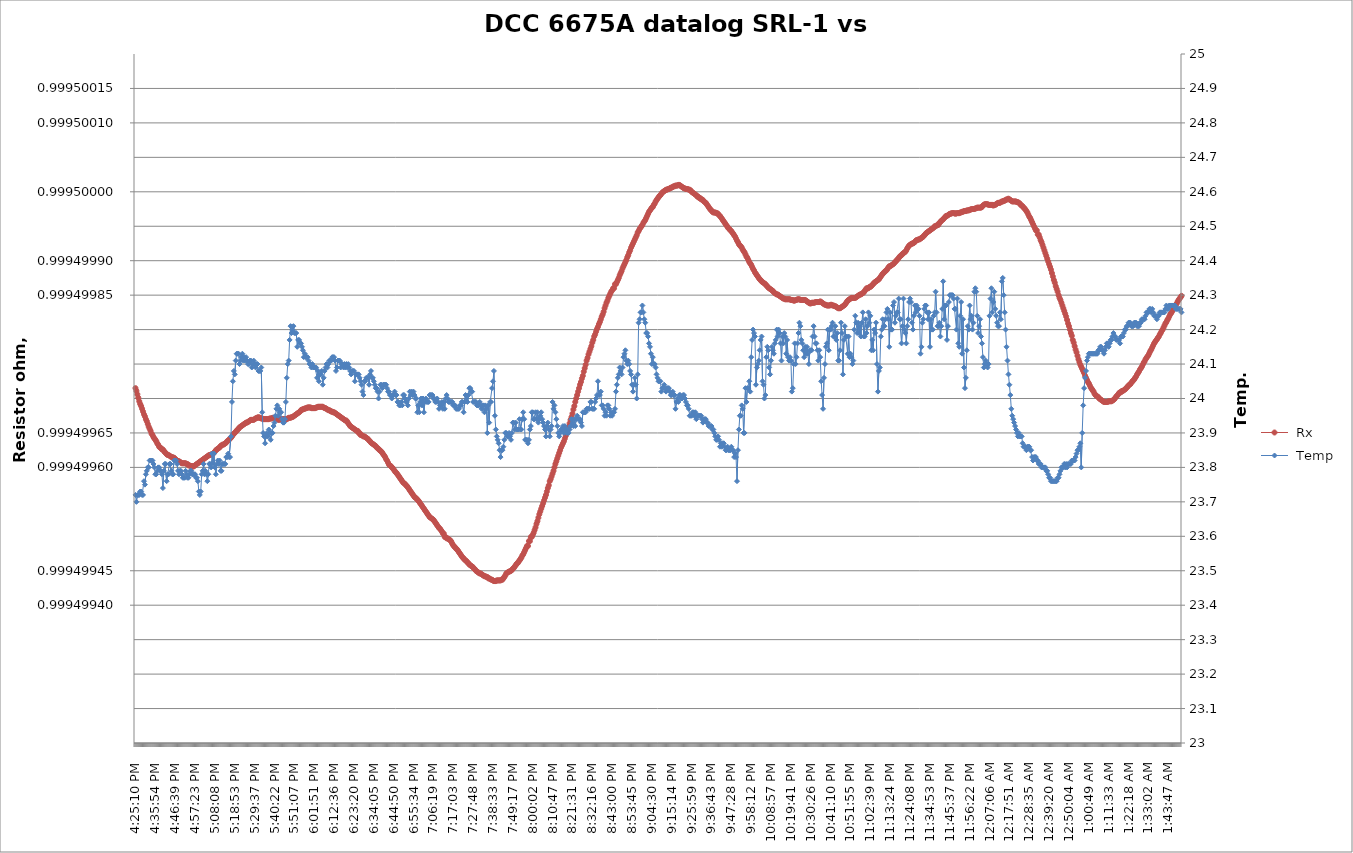
| Category |  Rx |
|---|---|
| 2021-03-13 16:25:10 | 0.999 |
| 2021-03-13 16:25:40 | 0.999 |
| 2021-03-13 16:26:11 | 0.999 |
| 2021-03-13 16:26:42 | 0.999 |
| 2021-03-13 16:27:12 | 0.999 |
| 2021-03-13 16:27:43 | 0.999 |
| 2021-03-13 16:28:14 | 0.999 |
| 2021-03-13 16:28:44 | 0.999 |
| 2021-03-13 16:29:15 | 0.999 |
| 2021-03-13 16:29:46 | 0.999 |
| 2021-03-13 16:30:17 | 0.999 |
| 2021-03-13 16:30:47 | 0.999 |
| 2021-03-13 16:31:18 | 0.999 |
| 2021-03-13 16:31:49 | 0.999 |
| 2021-03-13 16:32:19 | 0.999 |
| 2021-03-13 16:32:50 | 0.999 |
| 2021-03-13 16:33:21 | 0.999 |
| 2021-03-13 16:33:51 | 0.999 |
| 2021-03-13 16:34:22 | 0.999 |
| 2021-03-13 16:34:53 | 0.999 |
| 2021-03-13 16:35:23 | 0.999 |
| 2021-03-13 16:35:54 | 0.999 |
| 2021-03-13 16:36:25 | 0.999 |
| 2021-03-13 16:36:56 | 0.999 |
| 2021-03-13 16:37:26 | 0.999 |
| 2021-03-13 16:37:57 | 0.999 |
| 2021-03-13 16:38:28 | 0.999 |
| 2021-03-13 16:38:58 | 0.999 |
| 2021-03-13 16:39:29 | 0.999 |
| 2021-03-13 16:40:00 | 0.999 |
| 2021-03-13 16:40:30 | 0.999 |
| 2021-03-13 16:41:01 | 0.999 |
| 2021-03-13 16:41:32 | 0.999 |
| 2021-03-13 16:42:03 | 0.999 |
| 2021-03-13 16:42:33 | 0.999 |
| 2021-03-13 16:43:04 | 0.999 |
| 2021-03-13 16:43:35 | 0.999 |
| 2021-03-13 16:44:05 | 0.999 |
| 2021-03-13 16:44:36 | 0.999 |
| 2021-03-13 16:45:07 | 0.999 |
| 2021-03-13 16:45:37 | 0.999 |
| 2021-03-13 16:46:08 | 0.999 |
| 2021-03-13 16:46:39 | 0.999 |
| 2021-03-13 16:47:09 | 0.999 |
| 2021-03-13 16:47:40 | 0.999 |
| 2021-03-13 16:48:11 | 0.999 |
| 2021-03-13 16:48:42 | 0.999 |
| 2021-03-13 16:49:12 | 0.999 |
| 2021-03-13 16:49:43 | 0.999 |
| 2021-03-13 16:50:14 | 0.999 |
| 2021-03-13 16:50:44 | 0.999 |
| 2021-03-13 16:51:15 | 0.999 |
| 2021-03-13 16:51:46 | 0.999 |
| 2021-03-13 16:52:16 | 0.999 |
| 2021-03-13 16:52:47 | 0.999 |
| 2021-03-13 16:53:18 | 0.999 |
| 2021-03-13 16:53:49 | 0.999 |
| 2021-03-13 16:54:19 | 0.999 |
| 2021-03-13 16:54:50 | 0.999 |
| 2021-03-13 16:55:21 | 0.999 |
| 2021-03-13 16:55:51 | 0.999 |
| 2021-03-13 16:56:22 | 0.999 |
| 2021-03-13 16:56:53 | 0.999 |
| 2021-03-13 16:57:23 | 0.999 |
| 2021-03-13 16:57:54 | 0.999 |
| 2021-03-13 16:58:25 | 0.999 |
| 2021-03-13 16:58:56 | 0.999 |
| 2021-03-13 16:59:26 | 0.999 |
| 2021-03-13 16:59:57 | 0.999 |
| 2021-03-13 17:00:28 | 0.999 |
| 2021-03-13 17:00:58 | 0.999 |
| 2021-03-13 17:01:29 | 0.999 |
| 2021-03-13 17:02:00 | 0.999 |
| 2021-03-13 17:02:30 | 0.999 |
| 2021-03-13 17:03:01 | 0.999 |
| 2021-03-13 17:03:32 | 0.999 |
| 2021-03-13 17:04:02 | 0.999 |
| 2021-03-13 17:04:33 | 0.999 |
| 2021-03-13 17:05:04 | 0.999 |
| 2021-03-13 17:05:35 | 0.999 |
| 2021-03-13 17:06:05 | 0.999 |
| 2021-03-13 17:06:36 | 0.999 |
| 2021-03-13 17:07:07 | 0.999 |
| 2021-03-13 17:07:37 | 0.999 |
| 2021-03-13 17:08:08 | 0.999 |
| 2021-03-13 17:08:39 | 0.999 |
| 2021-03-13 17:09:09 | 0.999 |
| 2021-03-13 17:09:40 | 0.999 |
| 2021-03-13 17:10:11 | 0.999 |
| 2021-03-13 17:10:42 | 0.999 |
| 2021-03-13 17:11:12 | 0.999 |
| 2021-03-13 17:11:43 | 0.999 |
| 2021-03-13 17:12:14 | 0.999 |
| 2021-03-13 17:12:44 | 0.999 |
| 2021-03-13 17:13:15 | 0.999 |
| 2021-03-13 17:13:46 | 0.999 |
| 2021-03-13 17:14:16 | 0.999 |
| 2021-03-13 17:14:47 | 0.999 |
| 2021-03-13 17:15:18 | 0.999 |
| 2021-03-13 17:15:48 | 0.999 |
| 2021-03-13 17:16:19 | 0.999 |
| 2021-03-13 17:16:50 | 0.999 |
| 2021-03-13 17:17:21 | 0.999 |
| 2021-03-13 17:17:51 | 0.999 |
| 2021-03-13 17:18:22 | 0.999 |
| 2021-03-13 17:18:53 | 0.999 |
| 2021-03-13 17:19:23 | 0.999 |
| 2021-03-13 17:19:54 | 0.999 |
| 2021-03-13 17:20:25 | 0.999 |
| 2021-03-13 17:20:55 | 0.999 |
| 2021-03-13 17:21:26 | 0.999 |
| 2021-03-13 17:21:57 | 0.999 |
| 2021-03-13 17:22:28 | 0.999 |
| 2021-03-13 17:22:58 | 0.999 |
| 2021-03-13 17:23:29 | 0.999 |
| 2021-03-13 17:24:00 | 0.999 |
| 2021-03-13 17:24:30 | 0.999 |
| 2021-03-13 17:25:01 | 0.999 |
| 2021-03-13 17:25:32 | 0.999 |
| 2021-03-13 17:26:02 | 0.999 |
| 2021-03-13 17:26:33 | 0.999 |
| 2021-03-13 17:27:04 | 0.999 |
| 2021-03-13 17:27:34 | 0.999 |
| 2021-03-13 17:28:05 | 0.999 |
| 2021-03-13 17:28:36 | 0.999 |
| 2021-03-13 17:29:07 | 0.999 |
| 2021-03-13 17:29:37 | 0.999 |
| 2021-03-13 17:30:08 | 0.999 |
| 2021-03-13 17:30:39 | 0.999 |
| 2021-03-13 17:31:09 | 0.999 |
| 2021-03-13 17:31:40 | 0.999 |
| 2021-03-13 17:32:11 | 0.999 |
| 2021-03-13 17:32:41 | 0.999 |
| 2021-03-13 17:33:12 | 0.999 |
| 2021-03-13 17:33:43 | 0.999 |
| 2021-03-13 17:34:14 | 0.999 |
| 2021-03-13 17:34:44 | 0.999 |
| 2021-03-13 17:35:15 | 0.999 |
| 2021-03-13 17:35:46 | 0.999 |
| 2021-03-13 17:36:16 | 0.999 |
| 2021-03-13 17:36:47 | 0.999 |
| 2021-03-13 17:37:18 | 0.999 |
| 2021-03-13 17:37:48 | 0.999 |
| 2021-03-13 17:38:19 | 0.999 |
| 2021-03-13 17:38:50 | 0.999 |
| 2021-03-13 17:39:20 | 0.999 |
| 2021-03-13 17:39:51 | 0.999 |
| 2021-03-13 17:40:22 | 0.999 |
| 2021-03-13 17:40:53 | 0.999 |
| 2021-03-13 17:41:23 | 0.999 |
| 2021-03-13 17:41:54 | 0.999 |
| 2021-03-13 17:42:25 | 0.999 |
| 2021-03-13 17:42:55 | 0.999 |
| 2021-03-13 17:43:26 | 0.999 |
| 2021-03-13 17:43:57 | 0.999 |
| 2021-03-13 17:44:27 | 0.999 |
| 2021-03-13 17:44:58 | 0.999 |
| 2021-03-13 17:45:29 | 0.999 |
| 2021-03-13 17:46:00 | 0.999 |
| 2021-03-13 17:46:30 | 0.999 |
| 2021-03-13 17:47:01 | 0.999 |
| 2021-03-13 17:47:32 | 0.999 |
| 2021-03-13 17:48:02 | 0.999 |
| 2021-03-13 17:48:33 | 0.999 |
| 2021-03-13 17:49:04 | 0.999 |
| 2021-03-13 17:49:34 | 0.999 |
| 2021-03-13 17:50:05 | 0.999 |
| 2021-03-13 17:50:36 | 0.999 |
| 2021-03-13 17:51:07 | 0.999 |
| 2021-03-13 17:51:37 | 0.999 |
| 2021-03-13 17:52:08 | 0.999 |
| 2021-03-13 17:52:39 | 0.999 |
| 2021-03-13 17:53:09 | 0.999 |
| 2021-03-13 17:53:40 | 0.999 |
| 2021-03-13 17:54:11 | 0.999 |
| 2021-03-13 17:54:41 | 0.999 |
| 2021-03-13 17:55:12 | 0.999 |
| 2021-03-13 17:55:43 | 0.999 |
| 2021-03-13 17:56:14 | 0.999 |
| 2021-03-13 17:56:44 | 0.999 |
| 2021-03-13 17:57:15 | 0.999 |
| 2021-03-13 17:57:46 | 0.999 |
| 2021-03-13 17:58:16 | 0.999 |
| 2021-03-13 17:58:47 | 0.999 |
| 2021-03-13 17:59:18 | 0.999 |
| 2021-03-13 17:59:48 | 0.999 |
| 2021-03-13 18:00:19 | 0.999 |
| 2021-03-13 18:00:50 | 0.999 |
| 2021-03-13 18:01:20 | 0.999 |
| 2021-03-13 18:01:51 | 0.999 |
| 2021-03-13 18:02:22 | 0.999 |
| 2021-03-13 18:02:53 | 0.999 |
| 2021-03-13 18:03:23 | 0.999 |
| 2021-03-13 18:03:54 | 0.999 |
| 2021-03-13 18:04:25 | 0.999 |
| 2021-03-13 18:04:55 | 0.999 |
| 2021-03-13 18:05:26 | 0.999 |
| 2021-03-13 18:05:57 | 0.999 |
| 2021-03-13 18:06:27 | 0.999 |
| 2021-03-13 18:06:58 | 0.999 |
| 2021-03-13 18:07:29 | 0.999 |
| 2021-03-13 18:08:00 | 0.999 |
| 2021-03-13 18:08:30 | 0.999 |
| 2021-03-13 18:09:01 | 0.999 |
| 2021-03-13 18:09:32 | 0.999 |
| 2021-03-13 18:10:02 | 0.999 |
| 2021-03-13 18:10:33 | 0.999 |
| 2021-03-13 18:11:04 | 0.999 |
| 2021-03-13 18:11:34 | 0.999 |
| 2021-03-13 18:12:05 | 0.999 |
| 2021-03-13 18:12:36 | 0.999 |
| 2021-03-13 18:13:07 | 0.999 |
| 2021-03-13 18:13:37 | 0.999 |
| 2021-03-13 18:14:08 | 0.999 |
| 2021-03-13 18:14:39 | 0.999 |
| 2021-03-13 18:15:09 | 0.999 |
| 2021-03-13 18:15:40 | 0.999 |
| 2021-03-13 18:16:11 | 0.999 |
| 2021-03-13 18:16:41 | 0.999 |
| 2021-03-13 18:17:12 | 0.999 |
| 2021-03-13 18:17:43 | 0.999 |
| 2021-03-13 18:18:13 | 0.999 |
| 2021-03-13 18:18:44 | 0.999 |
| 2021-03-13 18:19:15 | 0.999 |
| 2021-03-13 18:19:46 | 0.999 |
| 2021-03-13 18:20:16 | 0.999 |
| 2021-03-13 18:20:47 | 0.999 |
| 2021-03-13 18:21:18 | 0.999 |
| 2021-03-13 18:21:48 | 0.999 |
| 2021-03-13 18:22:19 | 0.999 |
| 2021-03-13 18:22:50 | 0.999 |
| 2021-03-13 18:23:20 | 0.999 |
| 2021-03-13 18:23:51 | 0.999 |
| 2021-03-13 18:24:22 | 0.999 |
| 2021-03-13 18:24:53 | 0.999 |
| 2021-03-13 18:25:23 | 0.999 |
| 2021-03-13 18:25:54 | 0.999 |
| 2021-03-13 18:26:25 | 0.999 |
| 2021-03-13 18:26:55 | 0.999 |
| 2021-03-13 18:27:26 | 0.999 |
| 2021-03-13 18:27:57 | 0.999 |
| 2021-03-13 18:28:27 | 0.999 |
| 2021-03-13 18:28:58 | 0.999 |
| 2021-03-13 18:29:29 | 0.999 |
| 2021-03-13 18:29:59 | 0.999 |
| 2021-03-13 18:30:30 | 0.999 |
| 2021-03-13 18:31:01 | 0.999 |
| 2021-03-13 18:31:32 | 0.999 |
| 2021-03-13 18:32:02 | 0.999 |
| 2021-03-13 18:32:33 | 0.999 |
| 2021-03-13 18:33:04 | 0.999 |
| 2021-03-13 18:33:34 | 0.999 |
| 2021-03-13 18:34:05 | 0.999 |
| 2021-03-13 18:34:36 | 0.999 |
| 2021-03-13 18:35:06 | 0.999 |
| 2021-03-13 18:35:37 | 0.999 |
| 2021-03-13 18:36:08 | 0.999 |
| 2021-03-13 18:36:39 | 0.999 |
| 2021-03-13 18:37:09 | 0.999 |
| 2021-03-13 18:37:40 | 0.999 |
| 2021-03-13 18:38:11 | 0.999 |
| 2021-03-13 18:38:41 | 0.999 |
| 2021-03-13 18:39:12 | 0.999 |
| 2021-03-13 18:39:43 | 0.999 |
| 2021-03-13 18:40:13 | 0.999 |
| 2021-03-13 18:40:44 | 0.999 |
| 2021-03-13 18:41:15 | 0.999 |
| 2021-03-13 18:41:46 | 0.999 |
| 2021-03-13 18:42:16 | 0.999 |
| 2021-03-13 18:42:47 | 0.999 |
| 2021-03-13 18:43:18 | 0.999 |
| 2021-03-13 18:43:48 | 0.999 |
| 2021-03-13 18:44:19 | 0.999 |
| 2021-03-13 18:44:50 | 0.999 |
| 2021-03-13 18:45:20 | 0.999 |
| 2021-03-13 18:45:51 | 0.999 |
| 2021-03-13 18:46:22 | 0.999 |
| 2021-03-13 18:46:52 | 0.999 |
| 2021-03-13 18:47:23 | 0.999 |
| 2021-03-13 18:47:54 | 0.999 |
| 2021-03-13 18:48:25 | 0.999 |
| 2021-03-13 18:48:55 | 0.999 |
| 2021-03-13 18:49:26 | 0.999 |
| 2021-03-13 18:49:57 | 0.999 |
| 2021-03-13 18:50:27 | 0.999 |
| 2021-03-13 18:50:58 | 0.999 |
| 2021-03-13 18:51:29 | 0.999 |
| 2021-03-13 18:51:59 | 0.999 |
| 2021-03-13 18:52:30 | 0.999 |
| 2021-03-13 18:53:01 | 0.999 |
| 2021-03-13 18:53:31 | 0.999 |
| 2021-03-13 18:54:02 | 0.999 |
| 2021-03-13 18:54:33 | 0.999 |
| 2021-03-13 18:55:04 | 0.999 |
| 2021-03-13 18:55:34 | 0.999 |
| 2021-03-13 18:56:05 | 0.999 |
| 2021-03-13 18:56:36 | 0.999 |
| 2021-03-13 18:57:06 | 0.999 |
| 2021-03-13 18:57:37 | 0.999 |
| 2021-03-13 18:58:08 | 0.999 |
| 2021-03-13 18:58:38 | 0.999 |
| 2021-03-13 18:59:09 | 0.999 |
| 2021-03-13 18:59:40 | 0.999 |
| 2021-03-13 19:00:11 | 0.999 |
| 2021-03-13 19:00:41 | 0.999 |
| 2021-03-13 19:01:12 | 0.999 |
| 2021-03-13 19:01:43 | 0.999 |
| 2021-03-13 19:02:13 | 0.999 |
| 2021-03-13 19:02:44 | 0.999 |
| 2021-03-13 19:03:15 | 0.999 |
| 2021-03-13 19:03:45 | 0.999 |
| 2021-03-13 19:04:16 | 0.999 |
| 2021-03-13 19:04:47 | 0.999 |
| 2021-03-13 19:05:17 | 0.999 |
| 2021-03-13 19:05:48 | 0.999 |
| 2021-03-13 19:06:19 | 0.999 |
| 2021-03-13 19:06:50 | 0.999 |
| 2021-03-13 19:07:20 | 0.999 |
| 2021-03-13 19:07:51 | 0.999 |
| 2021-03-13 19:08:22 | 0.999 |
| 2021-03-13 19:08:52 | 0.999 |
| 2021-03-13 19:09:23 | 0.999 |
| 2021-03-13 19:09:54 | 0.999 |
| 2021-03-13 19:10:24 | 0.999 |
| 2021-03-13 19:10:55 | 0.999 |
| 2021-03-13 19:11:26 | 0.999 |
| 2021-03-13 19:11:56 | 0.999 |
| 2021-03-13 19:12:27 | 0.999 |
| 2021-03-13 19:12:58 | 0.999 |
| 2021-03-13 19:13:29 | 0.999 |
| 2021-03-13 19:13:59 | 0.999 |
| 2021-03-13 19:14:30 | 0.999 |
| 2021-03-13 19:15:01 | 0.999 |
| 2021-03-13 19:15:31 | 0.999 |
| 2021-03-13 19:16:02 | 0.999 |
| 2021-03-13 19:16:33 | 0.999 |
| 2021-03-13 19:17:03 | 0.999 |
| 2021-03-13 19:17:34 | 0.999 |
| 2021-03-13 19:18:05 | 0.999 |
| 2021-03-13 19:18:36 | 0.999 |
| 2021-03-13 19:19:06 | 0.999 |
| 2021-03-13 19:19:37 | 0.999 |
| 2021-03-13 19:20:08 | 0.999 |
| 2021-03-13 19:20:38 | 0.999 |
| 2021-03-13 19:21:09 | 0.999 |
| 2021-03-13 19:21:40 | 0.999 |
| 2021-03-13 19:22:10 | 0.999 |
| 2021-03-13 19:22:41 | 0.999 |
| 2021-03-13 19:23:12 | 0.999 |
| 2021-03-13 19:23:42 | 0.999 |
| 2021-03-13 19:24:13 | 0.999 |
| 2021-03-13 19:24:44 | 0.999 |
| 2021-03-13 19:25:15 | 0.999 |
| 2021-03-13 19:25:45 | 0.999 |
| 2021-03-13 19:26:16 | 0.999 |
| 2021-03-13 19:26:47 | 0.999 |
| 2021-03-13 19:27:17 | 0.999 |
| 2021-03-13 19:27:48 | 0.999 |
| 2021-03-13 19:28:19 | 0.999 |
| 2021-03-13 19:28:49 | 0.999 |
| 2021-03-13 19:29:20 | 0.999 |
| 2021-03-13 19:29:51 | 0.999 |
| 2021-03-13 19:30:21 | 0.999 |
| 2021-03-13 19:30:52 | 0.999 |
| 2021-03-13 19:31:23 | 0.999 |
| 2021-03-13 19:31:54 | 0.999 |
| 2021-03-13 19:32:24 | 0.999 |
| 2021-03-13 19:32:55 | 0.999 |
| 2021-03-13 19:33:26 | 0.999 |
| 2021-03-13 19:33:56 | 0.999 |
| 2021-03-13 19:34:27 | 0.999 |
| 2021-03-13 19:34:58 | 0.999 |
| 2021-03-13 19:35:28 | 0.999 |
| 2021-03-13 19:35:59 | 0.999 |
| 2021-03-13 19:36:30 | 0.999 |
| 2021-03-13 19:37:01 | 0.999 |
| 2021-03-13 19:37:31 | 0.999 |
| 2021-03-13 19:38:02 | 0.999 |
| 2021-03-13 19:38:33 | 0.999 |
| 2021-03-13 19:39:03 | 0.999 |
| 2021-03-13 19:39:34 | 0.999 |
| 2021-03-13 19:40:05 | 0.999 |
| 2021-03-13 19:40:35 | 0.999 |
| 2021-03-13 19:41:06 | 0.999 |
| 2021-03-13 19:41:37 | 0.999 |
| 2021-03-13 19:42:07 | 0.999 |
| 2021-03-13 19:42:38 | 0.999 |
| 2021-03-13 19:43:09 | 0.999 |
| 2021-03-13 19:43:40 | 0.999 |
| 2021-03-13 19:44:10 | 0.999 |
| 2021-03-13 19:44:41 | 0.999 |
| 2021-03-13 19:45:12 | 0.999 |
| 2021-03-13 19:45:42 | 0.999 |
| 2021-03-13 19:46:13 | 0.999 |
| 2021-03-13 19:46:44 | 0.999 |
| 2021-03-13 19:47:14 | 0.999 |
| 2021-03-13 19:47:45 | 0.999 |
| 2021-03-13 19:48:16 | 0.999 |
| 2021-03-13 19:48:47 | 0.999 |
| 2021-03-13 19:49:17 | 0.999 |
| 2021-03-13 19:49:48 | 0.999 |
| 2021-03-13 19:50:19 | 0.999 |
| 2021-03-13 19:50:49 | 0.999 |
| 2021-03-13 19:51:20 | 0.999 |
| 2021-03-13 19:51:51 | 0.999 |
| 2021-03-13 19:52:21 | 0.999 |
| 2021-03-13 19:52:52 | 0.999 |
| 2021-03-13 19:53:23 | 0.999 |
| 2021-03-13 19:53:54 | 0.999 |
| 2021-03-13 19:54:24 | 0.999 |
| 2021-03-13 19:54:55 | 0.999 |
| 2021-03-13 19:55:26 | 0.999 |
| 2021-03-13 19:55:56 | 0.999 |
| 2021-03-13 19:56:27 | 0.999 |
| 2021-03-13 19:56:58 | 0.999 |
| 2021-03-13 19:57:28 | 0.999 |
| 2021-03-13 19:57:59 | 0.999 |
| 2021-03-13 19:58:30 | 0.999 |
| 2021-03-13 19:59:00 | 0.999 |
| 2021-03-13 19:59:31 | 0.999 |
| 2021-03-13 20:00:02 | 0.999 |
| 2021-03-13 20:00:33 | 0.999 |
| 2021-03-13 20:01:03 | 0.999 |
| 2021-03-13 20:01:34 | 0.999 |
| 2021-03-13 20:02:05 | 0.999 |
| 2021-03-13 20:02:35 | 0.999 |
| 2021-03-13 20:03:06 | 0.999 |
| 2021-03-13 20:03:37 | 0.999 |
| 2021-03-13 20:04:07 | 0.999 |
| 2021-03-13 20:04:38 | 0.999 |
| 2021-03-13 20:05:09 | 0.999 |
| 2021-03-13 20:05:40 | 0.999 |
| 2021-03-13 20:06:10 | 0.999 |
| 2021-03-13 20:06:41 | 0.999 |
| 2021-03-13 20:07:12 | 0.999 |
| 2021-03-13 20:07:42 | 0.999 |
| 2021-03-13 20:08:13 | 0.999 |
| 2021-03-13 20:08:44 | 0.999 |
| 2021-03-13 20:09:14 | 0.999 |
| 2021-03-13 20:09:45 | 0.999 |
| 2021-03-13 20:10:16 | 0.999 |
| 2021-03-13 20:10:47 | 0.999 |
| 2021-03-13 20:11:17 | 0.999 |
| 2021-03-13 20:11:48 | 0.999 |
| 2021-03-13 20:12:19 | 0.999 |
| 2021-03-13 20:12:49 | 0.999 |
| 2021-03-13 20:13:20 | 0.999 |
| 2021-03-13 20:13:51 | 0.999 |
| 2021-03-13 20:14:21 | 0.999 |
| 2021-03-13 20:14:52 | 0.999 |
| 2021-03-13 20:15:23 | 0.999 |
| 2021-03-13 20:15:53 | 0.999 |
| 2021-03-13 20:16:24 | 0.999 |
| 2021-03-13 20:16:55 | 0.999 |
| 2021-03-13 20:17:26 | 0.999 |
| 2021-03-13 20:17:56 | 0.999 |
| 2021-03-13 20:18:27 | 0.999 |
| 2021-03-13 20:18:58 | 0.999 |
| 2021-03-13 20:19:28 | 0.999 |
| 2021-03-13 20:19:59 | 0.999 |
| 2021-03-13 20:20:30 | 0.999 |
| 2021-03-13 20:21:00 | 0.999 |
| 2021-03-13 20:21:31 | 0.999 |
| 2021-03-13 20:22:02 | 0.999 |
| 2021-03-13 20:22:32 | 0.999 |
| 2021-03-13 20:23:03 | 0.999 |
| 2021-03-13 20:23:34 | 0.999 |
| 2021-03-13 20:24:05 | 0.999 |
| 2021-03-13 20:24:35 | 0.999 |
| 2021-03-13 20:25:06 | 0.999 |
| 2021-03-13 20:25:37 | 0.999 |
| 2021-03-13 20:26:07 | 0.999 |
| 2021-03-13 20:26:38 | 0.999 |
| 2021-03-13 20:27:09 | 0.999 |
| 2021-03-13 20:27:39 | 0.999 |
| 2021-03-13 20:28:10 | 0.999 |
| 2021-03-13 20:28:41 | 0.999 |
| 2021-03-13 20:29:12 | 0.999 |
| 2021-03-13 20:29:42 | 0.999 |
| 2021-03-13 20:30:13 | 0.999 |
| 2021-03-13 20:30:44 | 0.999 |
| 2021-03-13 20:31:14 | 0.999 |
| 2021-03-13 20:31:45 | 0.999 |
| 2021-03-13 20:32:16 | 0.999 |
| 2021-03-13 20:32:46 | 0.999 |
| 2021-03-13 20:33:17 | 0.999 |
| 2021-03-13 20:33:48 | 0.999 |
| 2021-03-13 20:34:18 | 0.999 |
| 2021-03-13 20:34:49 | 0.999 |
| 2021-03-13 20:35:20 | 0.999 |
| 2021-03-13 20:35:51 | 0.999 |
| 2021-03-13 20:36:21 | 0.999 |
| 2021-03-13 20:36:52 | 0.999 |
| 2021-03-13 20:37:23 | 0.999 |
| 2021-03-13 20:37:53 | 0.999 |
| 2021-03-13 20:38:24 | 0.999 |
| 2021-03-13 20:38:55 | 0.999 |
| 2021-03-13 20:39:25 | 0.999 |
| 2021-03-13 20:39:56 | 0.999 |
| 2021-03-13 20:40:27 | 0.999 |
| 2021-03-13 20:40:58 | 0.999 |
| 2021-03-13 20:41:28 | 0.999 |
| 2021-03-13 20:41:59 | 0.999 |
| 2021-03-13 20:42:30 | 0.999 |
| 2021-03-13 20:43:00 | 0.999 |
| 2021-03-13 20:43:31 | 0.999 |
| 2021-03-13 20:44:02 | 0.999 |
| 2021-03-13 20:44:32 | 0.999 |
| 2021-03-13 20:45:03 | 0.999 |
| 2021-03-13 20:45:34 | 0.999 |
| 2021-03-13 20:46:05 | 0.999 |
| 2021-03-13 20:46:35 | 0.999 |
| 2021-03-13 20:47:06 | 0.999 |
| 2021-03-13 20:47:37 | 0.999 |
| 2021-03-13 20:48:07 | 0.999 |
| 2021-03-13 20:48:38 | 0.999 |
| 2021-03-13 20:49:09 | 0.999 |
| 2021-03-13 20:49:39 | 0.999 |
| 2021-03-13 20:50:10 | 0.999 |
| 2021-03-13 20:50:41 | 0.999 |
| 2021-03-13 20:51:11 | 0.999 |
| 2021-03-13 20:51:42 | 0.999 |
| 2021-03-13 20:52:13 | 0.999 |
| 2021-03-13 20:52:44 | 0.999 |
| 2021-03-13 20:53:14 | 0.999 |
| 2021-03-13 20:53:45 | 0.999 |
| 2021-03-13 20:54:16 | 0.999 |
| 2021-03-13 20:54:46 | 0.999 |
| 2021-03-13 20:55:17 | 0.999 |
| 2021-03-13 20:55:48 | 0.999 |
| 2021-03-13 20:56:18 | 0.999 |
| 2021-03-13 20:56:49 | 0.999 |
| 2021-03-13 20:57:20 | 0.999 |
| 2021-03-13 20:57:51 | 0.999 |
| 2021-03-13 20:58:21 | 0.999 |
| 2021-03-13 20:58:52 | 0.999 |
| 2021-03-13 20:59:23 | 0.999 |
| 2021-03-13 20:59:53 | 0.999 |
| 2021-03-13 21:00:24 | 0.999 |
| 2021-03-13 21:00:55 | 0.999 |
| 2021-03-13 21:01:25 | 0.999 |
| 2021-03-13 21:01:56 | 0.999 |
| 2021-03-13 21:02:27 | 0.999 |
| 2021-03-13 21:02:57 | 0.999 |
| 2021-03-13 21:03:28 | 0.999 |
| 2021-03-13 21:03:59 | 0.999 |
| 2021-03-13 21:04:30 | 0.999 |
| 2021-03-13 21:05:00 | 0.999 |
| 2021-03-13 21:05:31 | 0.999 |
| 2021-03-13 21:06:02 | 0.999 |
| 2021-03-13 21:06:32 | 0.999 |
| 2021-03-13 21:07:03 | 0.999 |
| 2021-03-13 21:07:34 | 0.999 |
| 2021-03-13 21:08:04 | 0.999 |
| 2021-03-13 21:08:35 | 0.999 |
| 2021-03-13 21:09:06 | 0.999 |
| 2021-03-13 21:09:36 | 0.999 |
| 2021-03-13 21:10:07 | 0.999 |
| 2021-03-13 21:10:38 | 1 |
| 2021-03-13 21:11:09 | 1 |
| 2021-03-13 21:11:39 | 1 |
| 2021-03-13 21:12:10 | 1 |
| 2021-03-13 21:12:41 | 1 |
| 2021-03-13 21:13:11 | 1 |
| 2021-03-13 21:13:42 | 1 |
| 2021-03-13 21:14:13 | 1 |
| 2021-03-13 21:14:43 | 1 |
| 2021-03-13 21:15:14 | 1 |
| 2021-03-13 21:15:45 | 1 |
| 2021-03-13 21:16:15 | 1 |
| 2021-03-13 21:16:46 | 1 |
| 2021-03-13 21:17:17 | 1 |
| 2021-03-13 21:17:48 | 1 |
| 2021-03-13 21:18:18 | 1 |
| 2021-03-13 21:18:49 | 1 |
| 2021-03-13 21:19:20 | 1 |
| 2021-03-13 21:19:50 | 1 |
| 2021-03-13 21:20:21 | 1 |
| 2021-03-13 21:20:52 | 1 |
| 2021-03-13 21:21:22 | 1 |
| 2021-03-13 21:21:53 | 1 |
| 2021-03-13 21:22:24 | 1 |
| 2021-03-13 21:22:54 | 1 |
| 2021-03-13 21:23:25 | 1 |
| 2021-03-13 21:23:56 | 1 |
| 2021-03-13 21:24:26 | 1 |
| 2021-03-13 21:24:57 | 1 |
| 2021-03-13 21:25:28 | 1 |
| 2021-03-13 21:25:59 | 1 |
| 2021-03-13 21:26:29 | 0.999 |
| 2021-03-13 21:27:00 | 0.999 |
| 2021-03-13 21:27:31 | 0.999 |
| 2021-03-13 21:28:01 | 0.999 |
| 2021-03-13 21:28:32 | 0.999 |
| 2021-03-13 21:29:03 | 0.999 |
| 2021-03-13 21:29:33 | 0.999 |
| 2021-03-13 21:30:04 | 0.999 |
| 2021-03-13 21:30:35 | 0.999 |
| 2021-03-13 21:31:05 | 0.999 |
| 2021-03-13 21:31:36 | 0.999 |
| 2021-03-13 21:32:07 | 0.999 |
| 2021-03-13 21:32:38 | 0.999 |
| 2021-03-13 21:33:08 | 0.999 |
| 2021-03-13 21:33:39 | 0.999 |
| 2021-03-13 21:34:10 | 0.999 |
| 2021-03-13 21:34:40 | 0.999 |
| 2021-03-13 21:35:11 | 0.999 |
| 2021-03-13 21:35:42 | 0.999 |
| 2021-03-13 21:36:12 | 0.999 |
| 2021-03-13 21:36:43 | 0.999 |
| 2021-03-13 21:37:14 | 0.999 |
| 2021-03-13 21:37:44 | 0.999 |
| 2021-03-13 21:38:15 | 0.999 |
| 2021-03-13 21:38:46 | 0.999 |
| 2021-03-13 21:39:17 | 0.999 |
| 2021-03-13 21:39:47 | 0.999 |
| 2021-03-13 21:40:18 | 0.999 |
| 2021-03-13 21:40:49 | 0.999 |
| 2021-03-13 21:41:19 | 0.999 |
| 2021-03-13 21:41:50 | 0.999 |
| 2021-03-13 21:42:21 | 0.999 |
| 2021-03-13 21:42:51 | 0.999 |
| 2021-03-13 21:43:22 | 0.999 |
| 2021-03-13 21:43:53 | 0.999 |
| 2021-03-13 21:44:23 | 0.999 |
| 2021-03-13 21:44:54 | 0.999 |
| 2021-03-13 21:45:25 | 0.999 |
| 2021-03-13 21:45:56 | 0.999 |
| 2021-03-13 21:46:26 | 0.999 |
| 2021-03-13 21:46:57 | 0.999 |
| 2021-03-13 21:47:28 | 0.999 |
| 2021-03-13 21:47:58 | 0.999 |
| 2021-03-13 21:48:29 | 0.999 |
| 2021-03-13 21:49:00 | 0.999 |
| 2021-03-13 21:49:30 | 0.999 |
| 2021-03-13 21:50:01 | 0.999 |
| 2021-03-13 21:50:32 | 0.999 |
| 2021-03-13 21:51:02 | 0.999 |
| 2021-03-13 21:51:33 | 0.999 |
| 2021-03-13 21:52:04 | 0.999 |
| 2021-03-13 21:52:34 | 0.999 |
| 2021-03-13 21:53:05 | 0.999 |
| 2021-03-13 21:53:36 | 0.999 |
| 2021-03-13 21:54:07 | 0.999 |
| 2021-03-13 21:54:37 | 0.999 |
| 2021-03-13 21:55:08 | 0.999 |
| 2021-03-13 21:55:39 | 0.999 |
| 2021-03-13 21:56:09 | 0.999 |
| 2021-03-13 21:56:40 | 0.999 |
| 2021-03-13 21:57:11 | 0.999 |
| 2021-03-13 21:57:41 | 0.999 |
| 2021-03-13 21:58:12 | 0.999 |
| 2021-03-13 21:58:43 | 0.999 |
| 2021-03-13 21:59:13 | 0.999 |
| 2021-03-13 21:59:44 | 0.999 |
| 2021-03-13 22:00:15 | 0.999 |
| 2021-03-13 22:00:46 | 0.999 |
| 2021-03-13 22:01:16 | 0.999 |
| 2021-03-13 22:01:47 | 0.999 |
| 2021-03-13 22:02:18 | 0.999 |
| 2021-03-13 22:02:48 | 0.999 |
| 2021-03-13 22:03:19 | 0.999 |
| 2021-03-13 22:03:50 | 0.999 |
| 2021-03-13 22:04:20 | 0.999 |
| 2021-03-13 22:04:51 | 0.999 |
| 2021-03-13 22:05:22 | 0.999 |
| 2021-03-13 22:05:52 | 0.999 |
| 2021-03-13 22:06:23 | 0.999 |
| 2021-03-13 22:06:54 | 0.999 |
| 2021-03-13 22:07:25 | 0.999 |
| 2021-03-13 22:07:55 | 0.999 |
| 2021-03-13 22:08:26 | 0.999 |
| 2021-03-13 22:08:57 | 0.999 |
| 2021-03-13 22:09:27 | 0.999 |
| 2021-03-13 22:09:58 | 0.999 |
| 2021-03-13 22:10:29 | 0.999 |
| 2021-03-13 22:10:59 | 0.999 |
| 2021-03-13 22:11:30 | 0.999 |
| 2021-03-13 22:12:01 | 0.999 |
| 2021-03-13 22:12:31 | 0.999 |
| 2021-03-13 22:13:02 | 0.999 |
| 2021-03-13 22:13:33 | 0.999 |
| 2021-03-13 22:14:04 | 0.999 |
| 2021-03-13 22:14:34 | 0.999 |
| 2021-03-13 22:15:05 | 0.999 |
| 2021-03-13 22:15:36 | 0.999 |
| 2021-03-13 22:16:06 | 0.999 |
| 2021-03-13 22:16:37 | 0.999 |
| 2021-03-13 22:17:08 | 0.999 |
| 2021-03-13 22:17:38 | 0.999 |
| 2021-03-13 22:18:09 | 0.999 |
| 2021-03-13 22:18:40 | 0.999 |
| 2021-03-13 22:19:10 | 0.999 |
| 2021-03-13 22:19:41 | 0.999 |
| 2021-03-13 22:20:12 | 0.999 |
| 2021-03-13 22:20:43 | 0.999 |
| 2021-03-13 22:21:13 | 0.999 |
| 2021-03-13 22:21:44 | 0.999 |
| 2021-03-13 22:22:15 | 0.999 |
| 2021-03-13 22:22:45 | 0.999 |
| 2021-03-13 22:23:16 | 0.999 |
| 2021-03-13 22:23:47 | 0.999 |
| 2021-03-13 22:24:17 | 0.999 |
| 2021-03-13 22:24:48 | 0.999 |
| 2021-03-13 22:25:19 | 0.999 |
| 2021-03-13 22:25:50 | 0.999 |
| 2021-03-13 22:26:20 | 0.999 |
| 2021-03-13 22:26:51 | 0.999 |
| 2021-03-13 22:27:22 | 0.999 |
| 2021-03-13 22:27:52 | 0.999 |
| 2021-03-13 22:28:23 | 0.999 |
| 2021-03-13 22:28:54 | 0.999 |
| 2021-03-13 22:29:24 | 0.999 |
| 2021-03-13 22:29:55 | 0.999 |
| 2021-03-13 22:30:26 | 0.999 |
| 2021-03-13 22:30:56 | 0.999 |
| 2021-03-13 22:31:27 | 0.999 |
| 2021-03-13 22:31:58 | 0.999 |
| 2021-03-13 22:32:29 | 0.999 |
| 2021-03-13 22:32:59 | 0.999 |
| 2021-03-13 22:33:30 | 0.999 |
| 2021-03-13 22:34:01 | 0.999 |
| 2021-03-13 22:34:31 | 0.999 |
| 2021-03-13 22:35:02 | 0.999 |
| 2021-03-13 22:35:33 | 0.999 |
| 2021-03-13 22:36:03 | 0.999 |
| 2021-03-13 22:36:34 | 0.999 |
| 2021-03-13 22:37:05 | 0.999 |
| 2021-03-13 22:37:35 | 0.999 |
| 2021-03-13 22:38:06 | 0.999 |
| 2021-03-13 22:38:37 | 0.999 |
| 2021-03-13 22:39:08 | 0.999 |
| 2021-03-13 22:39:38 | 0.999 |
| 2021-03-13 22:40:09 | 0.999 |
| 2021-03-13 22:40:40 | 0.999 |
| 2021-03-13 22:41:10 | 0.999 |
| 2021-03-13 22:41:41 | 0.999 |
| 2021-03-13 22:42:12 | 0.999 |
| 2021-03-13 22:42:42 | 0.999 |
| 2021-03-13 22:43:13 | 0.999 |
| 2021-03-13 22:43:44 | 0.999 |
| 2021-03-13 22:44:14 | 0.999 |
| 2021-03-13 22:44:45 | 0.999 |
| 2021-03-13 22:45:16 | 0.999 |
| 2021-03-13 22:45:46 | 0.999 |
| 2021-03-13 22:46:17 | 0.999 |
| 2021-03-13 22:46:48 | 0.999 |
| 2021-03-13 22:47:19 | 0.999 |
| 2021-03-13 22:47:49 | 0.999 |
| 2021-03-13 22:48:20 | 0.999 |
| 2021-03-13 22:48:51 | 0.999 |
| 2021-03-13 22:49:21 | 0.999 |
| 2021-03-13 22:49:52 | 0.999 |
| 2021-03-13 22:50:23 | 0.999 |
| 2021-03-13 22:50:53 | 0.999 |
| 2021-03-13 22:51:24 | 0.999 |
| 2021-03-13 22:51:55 | 0.999 |
| 2021-03-13 22:52:25 | 0.999 |
| 2021-03-13 22:52:56 | 0.999 |
| 2021-03-13 22:53:27 | 0.999 |
| 2021-03-13 22:53:58 | 0.999 |
| 2021-03-13 22:54:28 | 0.999 |
| 2021-03-13 22:54:59 | 0.999 |
| 2021-03-13 22:55:30 | 0.999 |
| 2021-03-13 22:56:00 | 0.999 |
| 2021-03-13 22:56:31 | 0.999 |
| 2021-03-13 22:57:02 | 0.999 |
| 2021-03-13 22:57:32 | 0.999 |
| 2021-03-13 22:58:03 | 0.999 |
| 2021-03-13 22:58:34 | 0.999 |
| 2021-03-13 22:59:04 | 0.999 |
| 2021-03-13 22:59:35 | 0.999 |
| 2021-03-13 23:00:06 | 0.999 |
| 2021-03-13 23:00:37 | 0.999 |
| 2021-03-13 23:01:07 | 0.999 |
| 2021-03-13 23:01:38 | 0.999 |
| 2021-03-13 23:02:09 | 0.999 |
| 2021-03-13 23:02:39 | 0.999 |
| 2021-03-13 23:03:10 | 0.999 |
| 2021-03-13 23:03:41 | 0.999 |
| 2021-03-13 23:04:11 | 0.999 |
| 2021-03-13 23:04:42 | 0.999 |
| 2021-03-13 23:05:13 | 0.999 |
| 2021-03-13 23:05:43 | 0.999 |
| 2021-03-13 23:06:14 | 0.999 |
| 2021-03-13 23:06:45 | 0.999 |
| 2021-03-13 23:07:16 | 0.999 |
| 2021-03-13 23:07:46 | 0.999 |
| 2021-03-13 23:08:17 | 0.999 |
| 2021-03-13 23:08:48 | 0.999 |
| 2021-03-13 23:09:18 | 0.999 |
| 2021-03-13 23:09:49 | 0.999 |
| 2021-03-13 23:10:20 | 0.999 |
| 2021-03-13 23:10:50 | 0.999 |
| 2021-03-13 23:11:21 | 0.999 |
| 2021-03-13 23:11:52 | 0.999 |
| 2021-03-13 23:12:22 | 0.999 |
| 2021-03-13 23:12:53 | 0.999 |
| 2021-03-13 23:13:24 | 0.999 |
| 2021-03-13 23:13:54 | 0.999 |
| 2021-03-13 23:14:25 | 0.999 |
| 2021-03-13 23:14:56 | 0.999 |
| 2021-03-13 23:15:27 | 0.999 |
| 2021-03-13 23:15:57 | 0.999 |
| 2021-03-13 23:16:28 | 0.999 |
| 2021-03-13 23:16:59 | 0.999 |
| 2021-03-13 23:17:29 | 0.999 |
| 2021-03-13 23:18:00 | 0.999 |
| 2021-03-13 23:18:31 | 0.999 |
| 2021-03-13 23:19:01 | 0.999 |
| 2021-03-13 23:19:32 | 0.999 |
| 2021-03-13 23:20:03 | 0.999 |
| 2021-03-13 23:20:33 | 0.999 |
| 2021-03-13 23:21:04 | 0.999 |
| 2021-03-13 23:21:35 | 0.999 |
| 2021-03-13 23:22:06 | 0.999 |
| 2021-03-13 23:22:36 | 0.999 |
| 2021-03-13 23:23:07 | 0.999 |
| 2021-03-13 23:23:38 | 0.999 |
| 2021-03-13 23:24:08 | 0.999 |
| 2021-03-13 23:24:39 | 0.999 |
| 2021-03-13 23:25:10 | 0.999 |
| 2021-03-13 23:25:40 | 0.999 |
| 2021-03-13 23:26:11 | 0.999 |
| 2021-03-13 23:26:42 | 0.999 |
| 2021-03-13 23:27:12 | 0.999 |
| 2021-03-13 23:27:43 | 0.999 |
| 2021-03-13 23:28:14 | 0.999 |
| 2021-03-13 23:28:45 | 0.999 |
| 2021-03-13 23:29:15 | 0.999 |
| 2021-03-13 23:29:46 | 0.999 |
| 2021-03-13 23:30:17 | 0.999 |
| 2021-03-13 23:30:47 | 0.999 |
| 2021-03-13 23:31:18 | 0.999 |
| 2021-03-13 23:31:49 | 0.999 |
| 2021-03-13 23:32:19 | 0.999 |
| 2021-03-13 23:32:50 | 0.999 |
| 2021-03-13 23:33:21 | 0.999 |
| 2021-03-13 23:33:51 | 0.999 |
| 2021-03-13 23:34:22 | 0.999 |
| 2021-03-13 23:34:53 | 0.999 |
| 2021-03-13 23:35:24 | 0.999 |
| 2021-03-13 23:35:54 | 0.999 |
| 2021-03-13 23:36:25 | 0.999 |
| 2021-03-13 23:36:56 | 0.999 |
| 2021-03-13 23:37:26 | 0.999 |
| 2021-03-13 23:37:57 | 0.999 |
| 2021-03-13 23:38:28 | 0.999 |
| 2021-03-13 23:38:58 | 0.999 |
| 2021-03-13 23:39:29 | 0.999 |
| 2021-03-13 23:40:00 | 0.999 |
| 2021-03-13 23:40:30 | 0.999 |
| 2021-03-13 23:41:01 | 0.999 |
| 2021-03-13 23:41:32 | 0.999 |
| 2021-03-13 23:42:03 | 0.999 |
| 2021-03-13 23:42:33 | 0.999 |
| 2021-03-13 23:43:04 | 0.999 |
| 2021-03-13 23:43:35 | 0.999 |
| 2021-03-13 23:44:05 | 0.999 |
| 2021-03-13 23:44:36 | 0.999 |
| 2021-03-13 23:45:07 | 0.999 |
| 2021-03-13 23:45:37 | 0.999 |
| 2021-03-13 23:46:08 | 0.999 |
| 2021-03-13 23:46:39 | 0.999 |
| 2021-03-13 23:47:09 | 0.999 |
| 2021-03-13 23:47:40 | 0.999 |
| 2021-03-13 23:48:11 | 0.999 |
| 2021-03-13 23:48:41 | 0.999 |
| 2021-03-13 23:49:12 | 0.999 |
| 2021-03-13 23:49:43 | 0.999 |
| 2021-03-13 23:50:14 | 0.999 |
| 2021-03-13 23:50:44 | 0.999 |
| 2021-03-13 23:51:15 | 0.999 |
| 2021-03-13 23:51:46 | 0.999 |
| 2021-03-13 23:52:16 | 0.999 |
| 2021-03-13 23:52:47 | 0.999 |
| 2021-03-13 23:53:18 | 0.999 |
| 2021-03-13 23:53:48 | 0.999 |
| 2021-03-13 23:54:19 | 0.999 |
| 2021-03-13 23:54:50 | 0.999 |
| 2021-03-13 23:55:20 | 0.999 |
| 2021-03-13 23:55:51 | 0.999 |
| 2021-03-13 23:56:22 | 0.999 |
| 2021-03-13 23:56:53 | 0.999 |
| 2021-03-13 23:57:23 | 0.999 |
| 2021-03-13 23:57:54 | 0.999 |
| 2021-03-13 23:58:25 | 0.999 |
| 2021-03-13 23:58:55 | 0.999 |
| 2021-03-13 23:59:26 | 0.999 |
| 2021-03-13 23:59:57 | 0.999 |
| 2021-03-14 00:00:27 | 0.999 |
| 2021-03-14 00:00:58 | 0.999 |
| 2021-03-14 00:01:29 | 0.999 |
| 2021-03-14 00:01:59 | 0.999 |
| 2021-03-14 00:02:30 | 0.999 |
| 2021-03-14 00:03:01 | 0.999 |
| 2021-03-14 00:03:32 | 0.999 |
| 2021-03-14 00:04:02 | 0.999 |
| 2021-03-14 00:04:33 | 0.999 |
| 2021-03-14 00:05:04 | 0.999 |
| 2021-03-14 00:05:34 | 0.999 |
| 2021-03-14 00:06:05 | 0.999 |
| 2021-03-14 00:06:36 | 0.999 |
| 2021-03-14 00:07:06 | 0.999 |
| 2021-03-14 00:07:37 | 0.999 |
| 2021-03-14 00:08:08 | 0.999 |
| 2021-03-14 00:08:38 | 0.999 |
| 2021-03-14 00:09:09 | 0.999 |
| 2021-03-14 00:09:40 | 0.999 |
| 2021-03-14 00:10:11 | 0.999 |
| 2021-03-14 00:10:41 | 0.999 |
| 2021-03-14 00:11:12 | 0.999 |
| 2021-03-14 00:11:43 | 0.999 |
| 2021-03-14 00:12:13 | 0.999 |
| 2021-03-14 00:12:44 | 0.999 |
| 2021-03-14 00:13:15 | 0.999 |
| 2021-03-14 00:13:45 | 0.999 |
| 2021-03-14 00:14:16 | 0.999 |
| 2021-03-14 00:14:47 | 0.999 |
| 2021-03-14 00:15:17 | 0.999 |
| 2021-03-14 00:15:48 | 0.999 |
| 2021-03-14 00:16:19 | 0.999 |
| 2021-03-14 00:16:50 | 0.999 |
| 2021-03-14 00:17:20 | 0.999 |
| 2021-03-14 00:17:51 | 0.999 |
| 2021-03-14 00:18:22 | 0.999 |
| 2021-03-14 00:18:52 | 0.999 |
| 2021-03-14 00:19:23 | 0.999 |
| 2021-03-14 00:19:54 | 0.999 |
| 2021-03-14 00:20:24 | 0.999 |
| 2021-03-14 00:20:55 | 0.999 |
| 2021-03-14 00:21:26 | 0.999 |
| 2021-03-14 00:21:56 | 0.999 |
| 2021-03-14 00:22:27 | 0.999 |
| 2021-03-14 00:22:58 | 0.999 |
| 2021-03-14 00:23:29 | 0.999 |
| 2021-03-14 00:23:59 | 0.999 |
| 2021-03-14 00:24:30 | 0.999 |
| 2021-03-14 00:25:01 | 0.999 |
| 2021-03-14 00:25:31 | 0.999 |
| 2021-03-14 00:26:02 | 0.999 |
| 2021-03-14 00:26:33 | 0.999 |
| 2021-03-14 00:27:03 | 0.999 |
| 2021-03-14 00:27:34 | 0.999 |
| 2021-03-14 00:28:05 | 0.999 |
| 2021-03-14 00:28:35 | 0.999 |
| 2021-03-14 00:29:06 | 0.999 |
| 2021-03-14 00:29:37 | 0.999 |
| 2021-03-14 00:30:07 | 0.999 |
| 2021-03-14 00:30:38 | 0.999 |
| 2021-03-14 00:31:09 | 0.999 |
| 2021-03-14 00:31:40 | 0.999 |
| 2021-03-14 00:32:10 | 0.999 |
| 2021-03-14 00:32:41 | 0.999 |
| 2021-03-14 00:33:12 | 0.999 |
| 2021-03-14 00:33:42 | 0.999 |
| 2021-03-14 00:34:13 | 0.999 |
| 2021-03-14 00:34:44 | 0.999 |
| 2021-03-14 00:35:14 | 0.999 |
| 2021-03-14 00:35:45 | 0.999 |
| 2021-03-14 00:36:16 | 0.999 |
| 2021-03-14 00:36:46 | 0.999 |
| 2021-03-14 00:37:17 | 0.999 |
| 2021-03-14 00:37:48 | 0.999 |
| 2021-03-14 00:38:18 | 0.999 |
| 2021-03-14 00:38:49 | 0.999 |
| 2021-03-14 00:39:20 | 0.999 |
| 2021-03-14 00:39:51 | 0.999 |
| 2021-03-14 00:40:21 | 0.999 |
| 2021-03-14 00:40:52 | 0.999 |
| 2021-03-14 00:41:23 | 0.999 |
| 2021-03-14 00:41:53 | 0.999 |
| 2021-03-14 00:42:24 | 0.999 |
| 2021-03-14 00:42:55 | 0.999 |
| 2021-03-14 00:43:25 | 0.999 |
| 2021-03-14 00:43:56 | 0.999 |
| 2021-03-14 00:44:27 | 0.999 |
| 2021-03-14 00:44:57 | 0.999 |
| 2021-03-14 00:45:28 | 0.999 |
| 2021-03-14 00:45:59 | 0.999 |
| 2021-03-14 00:46:29 | 0.999 |
| 2021-03-14 00:47:00 | 0.999 |
| 2021-03-14 00:47:31 | 0.999 |
| 2021-03-14 00:48:02 | 0.999 |
| 2021-03-14 00:48:32 | 0.999 |
| 2021-03-14 00:49:03 | 0.999 |
| 2021-03-14 00:49:34 | 0.999 |
| 2021-03-14 00:50:04 | 0.999 |
| 2021-03-14 00:50:35 | 0.999 |
| 2021-03-14 00:51:06 | 0.999 |
| 2021-03-14 00:51:36 | 0.999 |
| 2021-03-14 00:52:07 | 0.999 |
| 2021-03-14 00:52:38 | 0.999 |
| 2021-03-14 00:53:08 | 0.999 |
| 2021-03-14 00:53:39 | 0.999 |
| 2021-03-14 00:54:10 | 0.999 |
| 2021-03-14 00:54:40 | 0.999 |
| 2021-03-14 00:55:11 | 0.999 |
| 2021-03-14 00:55:42 | 0.999 |
| 2021-03-14 00:56:13 | 0.999 |
| 2021-03-14 00:56:43 | 0.999 |
| 2021-03-14 00:57:14 | 0.999 |
| 2021-03-14 00:57:45 | 0.999 |
| 2021-03-14 00:58:15 | 0.999 |
| 2021-03-14 00:58:46 | 0.999 |
| 2021-03-14 00:59:17 | 0.999 |
| 2021-03-14 00:59:47 | 0.999 |
| 2021-03-14 01:00:18 | 0.999 |
| 2021-03-14 01:00:49 | 0.999 |
| 2021-03-14 01:01:19 | 0.999 |
| 2021-03-14 01:01:50 | 0.999 |
| 2021-03-14 01:02:21 | 0.999 |
| 2021-03-14 01:02:51 | 0.999 |
| 2021-03-14 01:03:22 | 0.999 |
| 2021-03-14 01:03:53 | 0.999 |
| 2021-03-14 01:04:24 | 0.999 |
| 2021-03-14 01:04:54 | 0.999 |
| 2021-03-14 01:05:25 | 0.999 |
| 2021-03-14 01:05:56 | 0.999 |
| 2021-03-14 01:06:26 | 0.999 |
| 2021-03-14 01:06:57 | 0.999 |
| 2021-03-14 01:07:28 | 0.999 |
| 2021-03-14 01:07:58 | 0.999 |
| 2021-03-14 01:08:29 | 0.999 |
| 2021-03-14 01:09:00 | 0.999 |
| 2021-03-14 01:09:31 | 0.999 |
| 2021-03-14 01:10:01 | 0.999 |
| 2021-03-14 01:10:32 | 0.999 |
| 2021-03-14 01:11:03 | 0.999 |
| 2021-03-14 01:11:33 | 0.999 |
| 2021-03-14 01:12:04 | 0.999 |
| 2021-03-14 01:12:35 | 0.999 |
| 2021-03-14 01:13:05 | 0.999 |
| 2021-03-14 01:13:36 | 0.999 |
| 2021-03-14 01:14:07 | 0.999 |
| 2021-03-14 01:14:37 | 0.999 |
| 2021-03-14 01:15:08 | 0.999 |
| 2021-03-14 01:15:39 | 0.999 |
| 2021-03-14 01:16:09 | 0.999 |
| 2021-03-14 01:16:40 | 0.999 |
| 2021-03-14 01:17:11 | 0.999 |
| 2021-03-14 01:17:42 | 0.999 |
| 2021-03-14 01:18:12 | 0.999 |
| 2021-03-14 01:18:43 | 0.999 |
| 2021-03-14 01:19:14 | 0.999 |
| 2021-03-14 01:19:44 | 0.999 |
| 2021-03-14 01:20:15 | 0.999 |
| 2021-03-14 01:20:46 | 0.999 |
| 2021-03-14 01:21:16 | 0.999 |
| 2021-03-14 01:21:47 | 0.999 |
| 2021-03-14 01:22:18 | 0.999 |
| 2021-03-14 01:22:48 | 0.999 |
| 2021-03-14 01:23:19 | 0.999 |
| 2021-03-14 01:23:50 | 0.999 |
| 2021-03-14 01:24:20 | 0.999 |
| 2021-03-14 01:24:51 | 0.999 |
| 2021-03-14 01:25:22 | 0.999 |
| 2021-03-14 01:25:53 | 0.999 |
| 2021-03-14 01:26:23 | 0.999 |
| 2021-03-14 01:26:54 | 0.999 |
| 2021-03-14 01:27:25 | 0.999 |
| 2021-03-14 01:27:55 | 0.999 |
| 2021-03-14 01:28:26 | 0.999 |
| 2021-03-14 01:28:57 | 0.999 |
| 2021-03-14 01:29:27 | 0.999 |
| 2021-03-14 01:29:58 | 0.999 |
| 2021-03-14 01:30:29 | 0.999 |
| 2021-03-14 01:30:59 | 0.999 |
| 2021-03-14 01:31:30 | 0.999 |
| 2021-03-14 01:32:01 | 0.999 |
| 2021-03-14 01:32:32 | 0.999 |
| 2021-03-14 01:33:02 | 0.999 |
| 2021-03-14 01:33:33 | 0.999 |
| 2021-03-14 01:34:04 | 0.999 |
| 2021-03-14 01:34:34 | 0.999 |
| 2021-03-14 01:35:05 | 0.999 |
| 2021-03-14 01:35:36 | 0.999 |
| 2021-03-14 01:36:06 | 0.999 |
| 2021-03-14 01:36:37 | 0.999 |
| 2021-03-14 01:37:08 | 0.999 |
| 2021-03-14 01:37:38 | 0.999 |
| 2021-03-14 01:38:09 | 0.999 |
| 2021-03-14 01:38:40 | 0.999 |
| 2021-03-14 01:39:10 | 0.999 |
| 2021-03-14 01:39:41 | 0.999 |
| 2021-03-14 01:40:12 | 0.999 |
| 2021-03-14 01:40:43 | 0.999 |
| 2021-03-14 01:41:13 | 0.999 |
| 2021-03-14 01:41:44 | 0.999 |
| 2021-03-14 01:42:15 | 0.999 |
| 2021-03-14 01:42:45 | 0.999 |
| 2021-03-14 01:43:16 | 0.999 |
| 2021-03-14 01:43:47 | 0.999 |
| 2021-03-14 01:44:17 | 0.999 |
| 2021-03-14 01:44:48 | 0.999 |
| 2021-03-14 01:45:19 | 0.999 |
| 2021-03-14 01:45:49 | 0.999 |
| 2021-03-14 01:46:20 | 0.999 |
| 2021-03-14 01:46:51 | 0.999 |
| 2021-03-14 01:47:21 | 0.999 |
| 2021-03-14 01:47:52 | 0.999 |
| 2021-03-14 01:48:23 | 0.999 |
| 2021-03-14 01:48:54 | 0.999 |
| 2021-03-14 01:49:24 | 0.999 |
| 2021-03-14 01:49:55 | 0.999 |
| 2021-03-14 01:50:26 | 0.999 |
| 2021-03-14 01:50:56 | 0.999 |